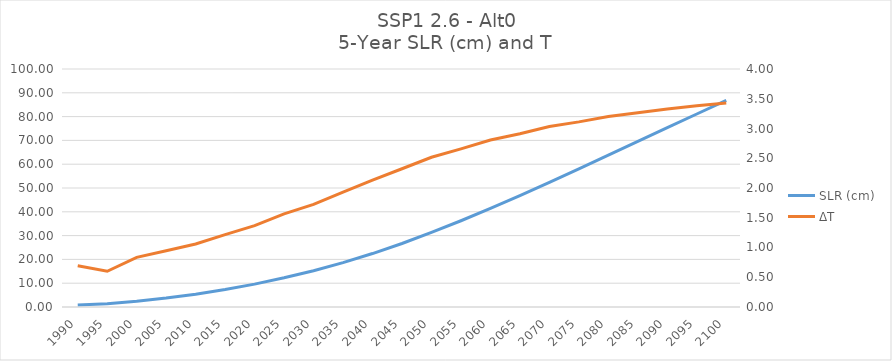
| Category | SLR (cm) |
|---|---|
| 1990.0 | 0.87 |
| 1995.0 | 1.399 |
| 2000.0 | 2.407 |
| 2005.0 | 3.755 |
| 2010.0 | 5.386 |
| 2015.0 | 7.344 |
| 2020.0 | 9.606 |
| 2025.0 | 12.264 |
| 2030.0 | 15.242 |
| 2035.0 | 18.64 |
| 2040.0 | 22.46 |
| 2045.0 | 26.685 |
| 2050.0 | 31.321 |
| 2055.0 | 36.235 |
| 2060.0 | 41.443 |
| 2065.0 | 46.815 |
| 2070.0 | 52.391 |
| 2075.0 | 58.041 |
| 2080.0 | 63.791 |
| 2085.0 | 69.562 |
| 2090.0 | 75.335 |
| 2095.0 | 81.098 |
| 2100.0 | 86.809 |